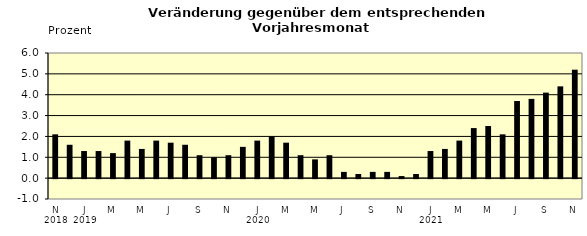
| Category | Series 0 |
|---|---|
| 0 | 2.1 |
| 1 | 1.6 |
| 2 | 1.3 |
| 3 | 1.3 |
| 4 | 1.2 |
| 5 | 1.8 |
| 6 | 1.4 |
| 7 | 1.8 |
| 8 | 1.7 |
| 9 | 1.6 |
| 10 | 1.1 |
| 11 | 1 |
| 12 | 1.1 |
| 13 | 1.5 |
| 14 | 1.8 |
| 15 | 2 |
| 16 | 1.7 |
| 17 | 1.1 |
| 18 | 0.9 |
| 19 | 1.1 |
| 20 | 0.3 |
| 21 | 0.2 |
| 22 | 0.3 |
| 23 | 0.3 |
| 24 | 0.1 |
| 25 | 0.2 |
| 26 | 1.3 |
| 27 | 1.4 |
| 28 | 1.8 |
| 29 | 2.4 |
| 30 | 2.5 |
| 31 | 2.1 |
| 32 | 3.7 |
| 33 | 3.8 |
| 34 | 4.1 |
| 35 | 4.4 |
| 36 | 5.2 |